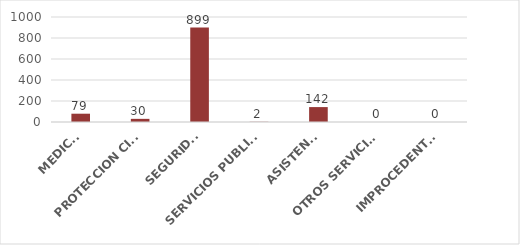
| Category | TOTAL |
|---|---|
| MEDICO | 79 |
| PROTECCION CIVIL | 30 |
| SEGURIDAD | 899 |
| SERVICIOS PUBLICOS | 2 |
| ASISTENCIA | 142 |
| OTROS SERVICIOS | 0 |
| IMPROCEDENTES | 0 |